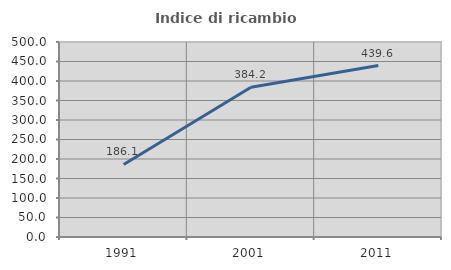
| Category | Indice di ricambio occupazionale  |
|---|---|
| 1991.0 | 186.111 |
| 2001.0 | 384.211 |
| 2011.0 | 439.623 |